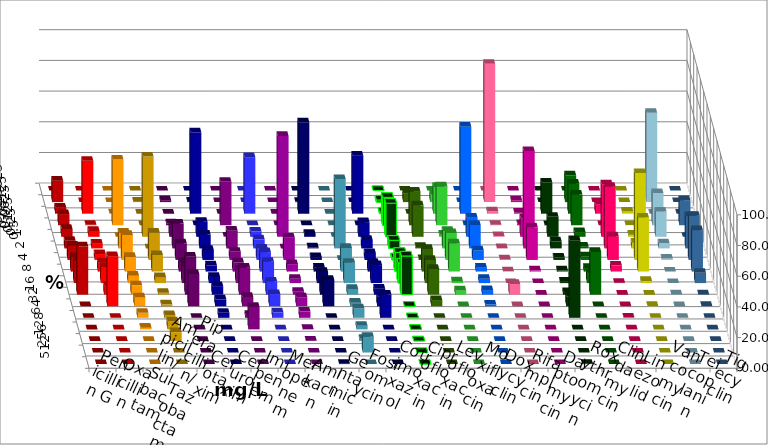
| Category | Penicillin G | Oxacillin | Ampicillin/ Sulbactam | Piperacillin/ Tazobactam | Cefotaxim | Cefuroxim | Imipenem | Meropenem | Amikacin | Gentamicin | Fosfomycin | Cotrimoxazol | Ciprofloxacin | Levofloxacin | Moxifloxacin | Doxycyclin | Rifampicin | Daptomycin | Roxythromycin | Clindamycin | Linezolid | Vancomycin | Teicoplanin | Tigecyclin |
|---|---|---|---|---|---|---|---|---|---|---|---|---|---|---|---|---|---|---|---|---|---|---|---|---|
| 0.015625 | 0 | 0 | 0 | 0 | 0 | 0 | 0 | 0 | 0 | 0 | 0 | 0 | 0 | 0 | 0 | 0 | 0 | 0 | 0 | 0 | 0 | 0 | 0 | 0 |
| 0.03125 | 13.975 | 0 | 0 | 0.311 | 1.244 | 0 | 0.31 | 0 | 0 | 0.156 | 0 | 0 | 1.4 | 5.435 | 4.814 | 0 | 90.093 | 1.085 | 0 | 17.337 | 0 | 0 | 0 | 58.15 |
| 0.0625 | 3.882 | 34.467 | 0.156 | 0 | 0 | 0 | 53.023 | 36.858 | 0 | 59.565 | 0 | 37.812 | 1.089 | 0 | 17.391 | 56.698 | 1.548 | 0.62 | 20.31 | 19.505 | 6.192 | 1.389 | 0 | 0 |
| 0.125 | 7.298 | 0.309 | 42.768 | 0 | 1.244 | 28.305 | 0 | 0 | 0 | 0 | 0.156 | 0 | 18.196 | 21.894 | 25.311 | 0 | 0.31 | 0.775 | 0.155 | 19.969 | 0 | 0.154 | 16.33 | 21.003 |
| 0.25 | 5.124 | 3.864 | 0 | 52.255 | 7.932 | 0.156 | 9.767 | 3.421 | 65.732 | 1.866 | 0 | 9.531 | 21.928 | 20.497 | 1.398 | 12.461 | 0.464 | 12.093 | 13.023 | 3.096 | 34.211 | 1.389 | 0 | 16.458 |
| 0.5 | 4.969 | 3.091 | 10.264 | 0 | 16.174 | 11.509 | 8.992 | 5.91 | 0 | 0.622 | 45.101 | 5.469 | 5.288 | 0.932 | 11.335 | 15.265 | 0.155 | 63.411 | 4.496 | 1.084 | 40.093 | 3.704 | 20.995 | 3.292 |
| 1.0 | 9.317 | 3.864 | 16.33 | 17.729 | 10.731 | 5.288 | 6.512 | 7.309 | 14.486 | 1.866 | 0 | 4.531 | 1.4 | 0.621 | 17.547 | 6.231 | 0.31 | 21.24 | 1.55 | 2.322 | 15.325 | 56.636 | 28.771 | 0.94 |
| 2.0 | 9.472 | 5.719 | 9.487 | 10.731 | 6.221 | 5.91 | 4.031 | 12.597 | 4.829 | 2.488 | 15.397 | 5.625 | 12.442 | 14.752 | 18.323 | 2.492 | 0.155 | 0.775 | 0.775 | 2.322 | 3.87 | 35.185 | 26.905 | 0 |
| 4.0 | 14.441 | 10.51 | 4.821 | 3.888 | 10.731 | 8.709 | 4.031 | 13.841 | 2.804 | 7.309 | 13.219 | 11.719 | 13.064 | 15.062 | 1.087 | 2.804 | 0 | 0 | 0.93 | 6.502 | 0.155 | 1.389 | 6.687 | 0 |
| 8.0 | 31.522 | 5.564 | 6.065 | 1.244 | 24.728 | 17.574 | 5.581 | 8.554 | 1.869 | 8.865 | 3.733 | 3.906 | 25.194 | 16.77 | 2.795 | 2.96 | 6.966 | 0 | 1.705 | 27.864 | 0 | 0 | 0.156 | 0.157 |
| 16.0 | 0 | 32.612 | 5.754 | 1.244 | 20.995 | 6.065 | 4.496 | 7.932 | 5.763 | 17.107 | 2.333 | 6.25 | 0 | 4.037 | 0 | 1.09 | 0 | 0 | 6.357 | 0 | 0 | 0.154 | 0.156 | 0 |
| 32.0 | 0 | 0 | 3.266 | 1.711 | 0 | 1.866 | 3.256 | 3.577 | 4.05 | 0 | 6.065 | 15.156 | 0 | 0 | 0 | 0 | 0 | 0 | 50.543 | 0 | 0.155 | 0 | 0 | 0 |
| 64.0 | 0 | 0 | 1.089 | 5.132 | 0 | 14.619 | 0 | 0 | 0.312 | 0 | 2.333 | 0 | 0 | 0 | 0 | 0 | 0 | 0 | 0 | 0 | 0 | 0 | 0 | 0 |
| 128.0 | 0 | 0 | 0 | 5.754 | 0 | 0 | 0 | 0 | 0.156 | 0 | 1.4 | 0 | 0 | 0 | 0 | 0 | 0 | 0 | 0 | 0 | 0 | 0 | 0 | 0 |
| 256.0 | 0 | 0 | 0 | 0 | 0 | 0 | 0 | 0 | 0 | 0 | 10.264 | 0 | 0 | 0 | 0 | 0 | 0 | 0 | 0 | 0 | 0 | 0 | 0 | 0 |
| 512.0 | 0 | 0 | 0 | 0 | 0 | 0 | 0 | 0 | 0 | 0.156 | 0 | 0 | 0 | 0 | 0 | 0 | 0 | 0 | 0.155 | 0 | 0 | 0 | 0 | 0 |